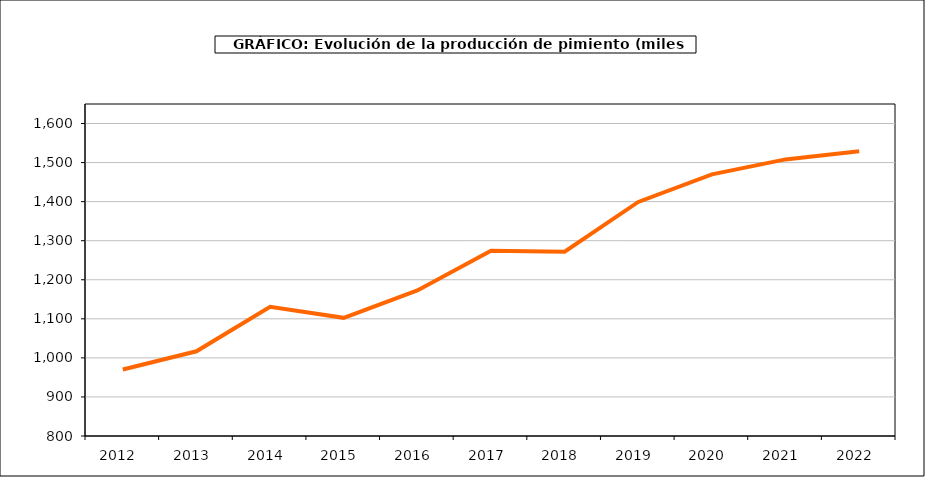
| Category | producción |
|---|---|
| 2012.0 | 970.296 |
| 2013.0 | 1016.811 |
| 2014.0 | 1130.863 |
| 2015.0 | 1102.522 |
| 2016.0 | 1172.639 |
| 2017.0 | 1274.264 |
| 2018.0 | 1271.721 |
| 2019.0 | 1399.192 |
| 2020.0 | 1469.969 |
| 2021.0 | 1508.168 |
| 2022.0 | 1529.034 |